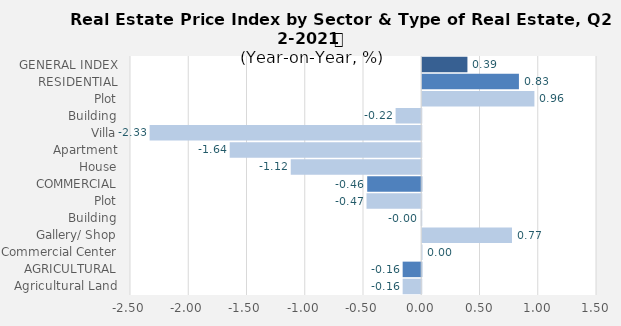
| Category | Q2- 2020 |
|---|---|
| GENERAL INDEX | 0.388 |
| RESIDENTIAL | 0.83 |
| Plot | 0.963 |
| Building | -0.22 |
| Villa | -2.332 |
| Apartment | -1.644 |
| House | -1.12 |
| COMMERCIAL | -0.464 |
| Plot | -0.47 |
| Building | -0.004 |
| Gallery/ Shop | 0.77 |
| Commercial Center | 0.002 |
| AGRICULTURAL | -0.16 |
| Agricultural Land | -0.16 |